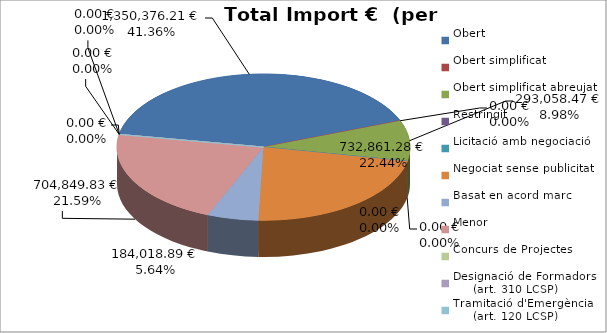
| Category | Total preu
(amb IVA) |
|---|---|
| Obert | 1350376.21 |
| Obert simplificat | 0 |
| Obert simplificat abreujat | 293058.47 |
| Restringit | 0 |
| Licitació amb negociació | 0 |
| Negociat sense publicitat | 732861.28 |
| Basat en acord marc | 184018.89 |
| Menor | 704849.83 |
| Concurs de Projectes | 0 |
| Designació de Formadors
     (art. 310 LCSP) | 0 |
| Tramitació d'Emergència
     (art. 120 LCSP) | 0 |